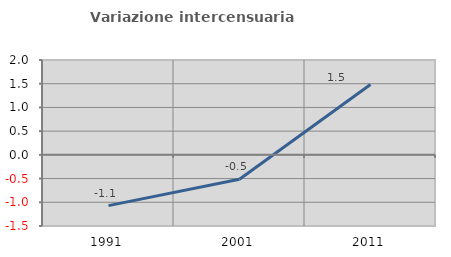
| Category | Variazione intercensuaria annua |
|---|---|
| 1991.0 | -1.07 |
| 2001.0 | -0.515 |
| 2011.0 | 1.485 |